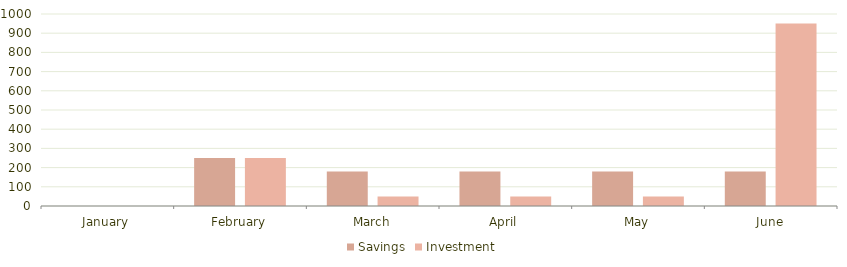
| Category | Savings | Investment |
|---|---|---|
| January | 0 | 0 |
| February | 250 | 250 |
| March | 180 | 50 |
| April | 180 | 50 |
| May | 180 | 50 |
| June | 180 | 950 |